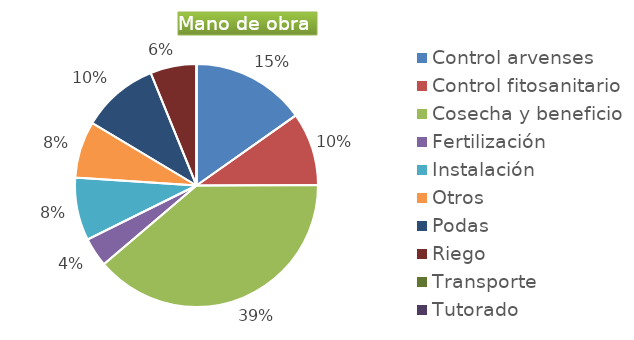
| Category | Series 0 |
|---|---|
| Control arvenses | 7924764 |
| Control fitosanitario | 5058360 |
| Cosecha y beneficio | 20233440 |
| Fertilización | 2023344 |
| Instalación | 4357597 |
| Otros | 3934280 |
| Podas | 5339380 |
| Riego | 3203628 |
| Transporte | 0 |
| Tutorado | 0 |